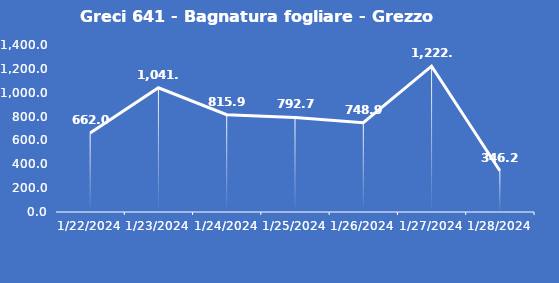
| Category | Greci 641 - Bagnatura fogliare - Grezzo (min) |
|---|---|
| 1/22/24 | 662 |
| 1/23/24 | 1041.6 |
| 1/24/24 | 815.9 |
| 1/25/24 | 792.7 |
| 1/26/24 | 748.9 |
| 1/27/24 | 1222.7 |
| 1/28/24 | 346.2 |